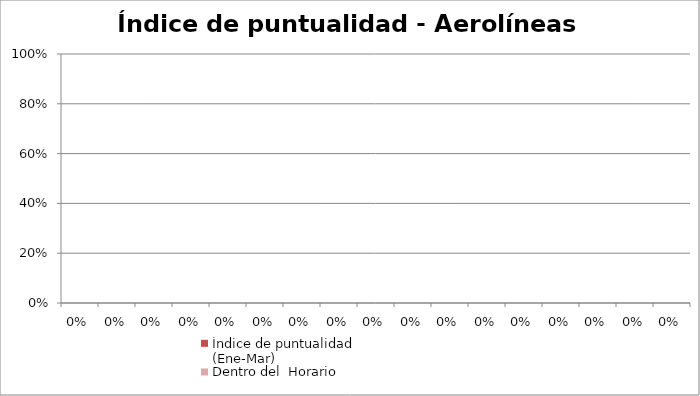
| Category | Índice de puntualidad
(Ene-Mar) | Dentro del  Horario |
|---|---|---|
| 0.0 | 0 | 0 |
| 0.0 | 0 | 0 |
| 0.0 | 0 | 0 |
| 0.0 | 0 | 0 |
| 0.0 | 0 | 0 |
| 0.0 | 0 | 0 |
| 0.0 | 0 | 0 |
| 0.0 | 0 | 0 |
| 0.0 | 0 | 0 |
| 0.0 | 0 | 0 |
| 0.0 | 0 | 0 |
| 0.0 | 0 | 0 |
| 0.0 | 0 | 0 |
| 0.0 | 0 | 0 |
| 0.0 | 0 | 0 |
| 0.0 | 0 | 0 |
| 0.0 | 0 | 0 |